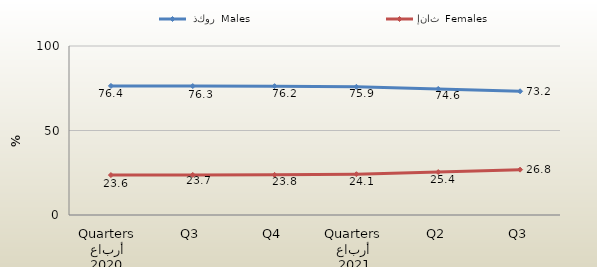
| Category |  ذكور  Males | إناث  Females |
|---|---|---|
| 0 | 76.38 | 23.62 |
| 1 | 76.286 | 23.714 |
| 2 | 76.241 | 23.759 |
| 3 | 75.852 | 24.148 |
| 4 | 74.599 | 25.401 |
| 5 | 73.206 | 26.833 |